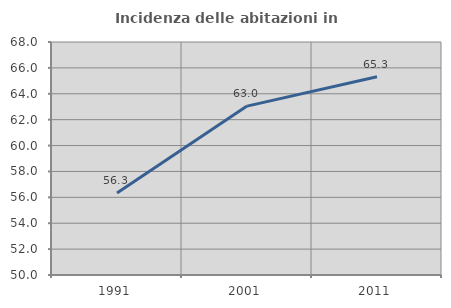
| Category | Incidenza delle abitazioni in proprietà  |
|---|---|
| 1991.0 | 56.332 |
| 2001.0 | 63.048 |
| 2011.0 | 65.321 |